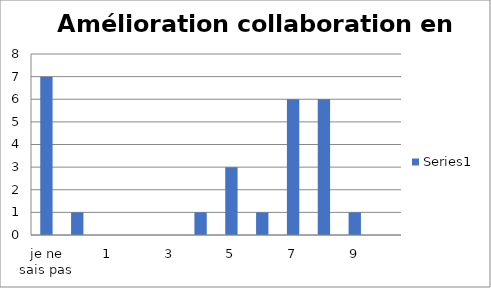
| Category | Series 0 |
|---|---|
| je ne sais pas | 7 |
| 0 | 1 |
| 1 | 0 |
| 2 | 0 |
| 3 | 0 |
| 4 | 1 |
| 5 | 3 |
| 6 | 1 |
| 7 | 6 |
| 8 | 6 |
| 9 | 1 |
| 10 | 0 |